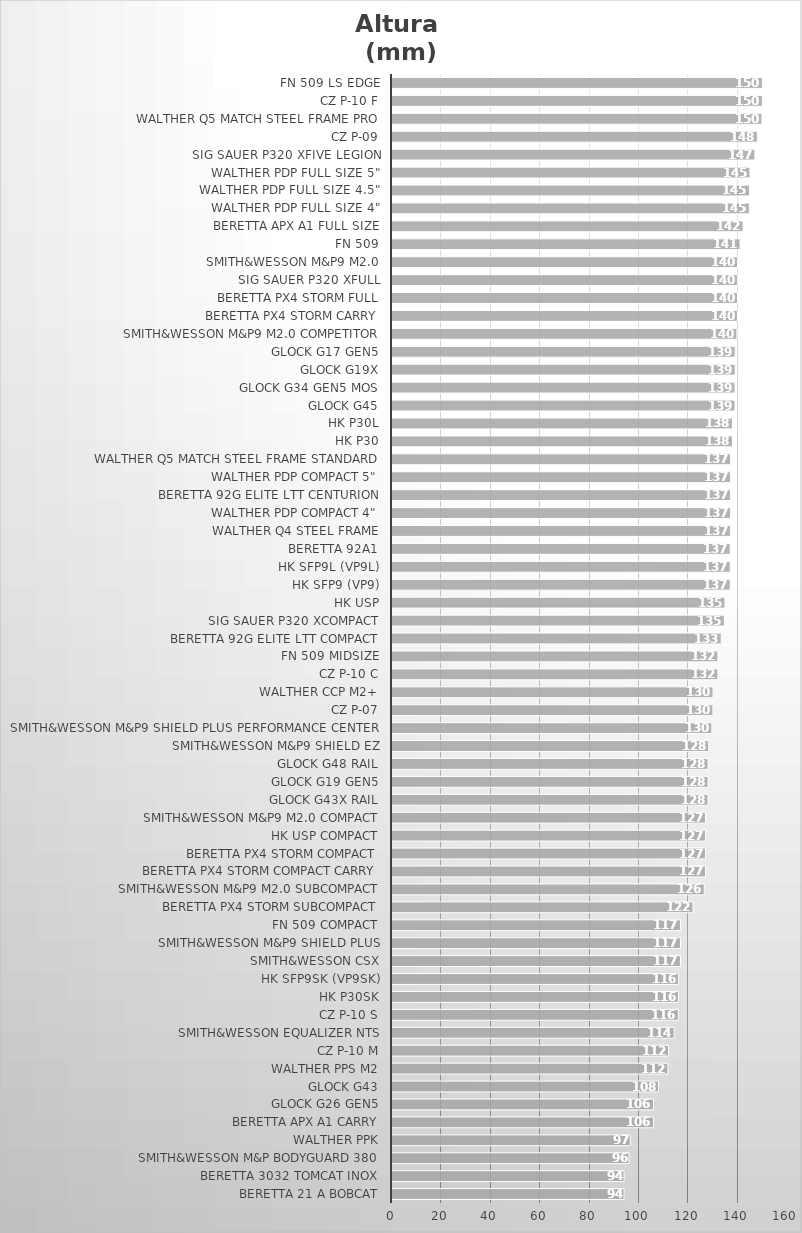
| Category | Altura 
(mm) |
|---|---|
| Beretta 21 A Bobcat | 93.98 |
| Beretta 3032 Tomcat Inox | 93.98 |
| Smith&Wesson M&P Bodyguard 380 | 96.012 |
| Walther PPK | 96.52 |
| Beretta APX A1 Carry | 105.918 |
| Glock G26 Gen5 | 105.918 |
| Glock G43 | 107.95 |
| Walther PPS M2 | 111.76 |
| CZ P-10 M | 112 |
| Smith&Wesson Equalizer NTS | 114.3 |
| CZ P-10 S | 116 |
| HK P30SK | 116.078 |
| HK SFP9SK (VP9SK) | 116.078 |
| Smith&Wesson CSX | 116.84 |
| Smith&Wesson M&P9 Shield Plus | 116.84 |
| FN 509 Compact | 116.84 |
| Beretta Px4 Storm SubCompact | 121.92 |
| Smith&Wesson M&P9 M2.0 Subcompact | 126.492 |
| Beretta Px4 Storm Compact Carry | 127 |
| Beretta Px4 Storm Compact | 127 |
| HK USP Compact | 127 |
| Smith&Wesson M&P9 M2.0 Compact | 127 |
| Glock G43X Rail | 128.016 |
| Glock G19 Gen5 | 128.016 |
| Glock G48 Rail | 128.016 |
| Smith&Wesson M&P9 Shield EZ | 128.27 |
| Smith&Wesson M&P9 Shield Plus Performance Center | 129.54 |
| CZ P-07 | 130 |
| Walther CCP M2+ | 130.048 |
| CZ P-10 C | 132 |
| FN 509 Midsize | 132 |
| Beretta 92G Elite LTT Compact | 133.35 |
| SIG Sauer P320 XCOMPACT | 134.62 |
| HK USP | 134.874 |
| HK SFP9 (VP9) | 137 |
| HK SFP9L (VP9L) | 137 |
| Beretta 92A1 | 137 |
| Walther Q4 Steel Frame | 137.16 |
| Walther PDP Compact 4" | 137.16 |
| Beretta 92G Elite LTT Centurion | 137.16 |
| Walther PDP Compact 5" | 137.16 |
| Walther Q5 Match Steel Frame Standard | 137.16 |
| HK P30 | 137.922 |
| HK P30L | 137.922 |
| Glock G45 | 138.938 |
| Glock G34 Gen5 MOS | 138.938 |
| Glock G19X | 139 |
| Glock G17 Gen5 | 139 |
| Smith&Wesson M&P9 M2.0 Competitor | 139.7 |
| Beretta Px4 Storm Carry | 139.954 |
| Beretta Px4 Storm Full | 139.954 |
| SIG Sauer P320 XFULL | 140 |
| Smith&Wesson M&P9 M2.0 | 140 |
| FN 509 | 141 |
| Beretta APX A1 Full Size | 142.24 |
| Walther PDP Full Size 4" | 144.78 |
| Walther PDP Full Size 4.5" | 144.78 |
| Walther PDP Full Size 5" | 145 |
| SIG Sauer P320 XFIVE Legion | 147 |
| CZ P-09 | 148 |
| Walther Q5 Match Steel Frame Pro | 149.86 |
| CZ P-10 F | 150 |
| FN 509 LS Edge | 150 |